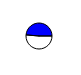
| Category | Series 0 |
|---|---|
| 0 | 23221 |
| 1 | 21994 |